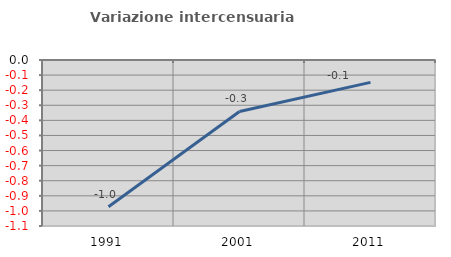
| Category | Variazione intercensuaria annua |
|---|---|
| 1991.0 | -0.973 |
| 2001.0 | -0.341 |
| 2011.0 | -0.148 |